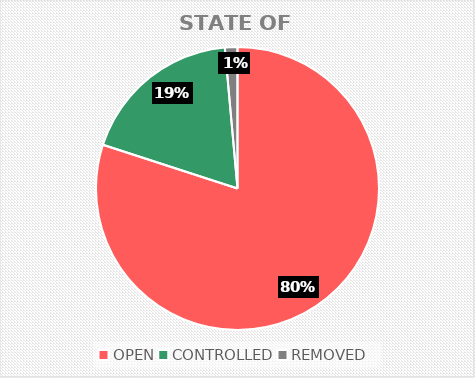
| Category | STATE OF HAZARD |
|---|---|
| OPEN | 56 |
| CONTROLLED | 13 |
| REMOVED | 1 |